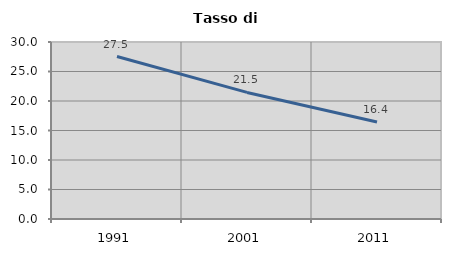
| Category | Tasso di disoccupazione   |
|---|---|
| 1991.0 | 27.537 |
| 2001.0 | 21.453 |
| 2011.0 | 16.436 |